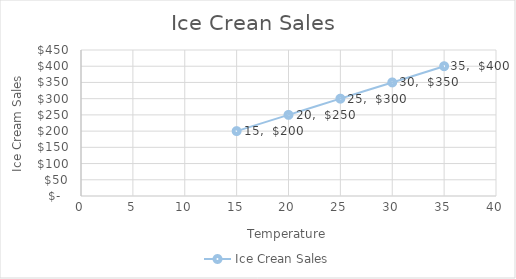
| Category | Ice Crean Sales |
|---|---|
| 15.0 | 200 |
| 20.0 | 250 |
| 25.0 | 300 |
| 30.0 | 350 |
| 35.0 | 400 |